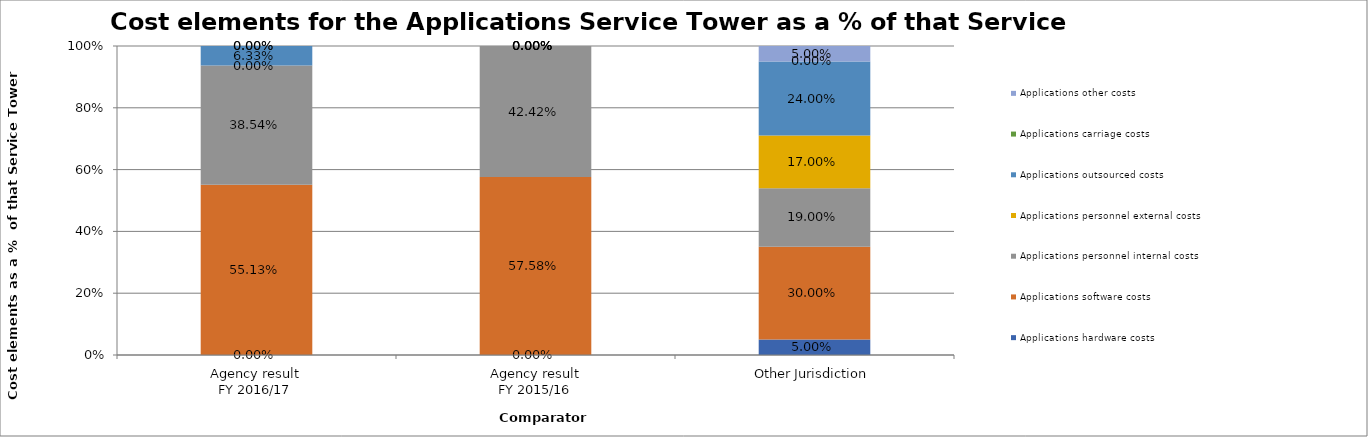
| Category | Applications hardware costs | Applications software costs | Applications personnel internal costs | Applications personnel external costs | Applications outsourced costs | Applications carriage costs | Applications other costs |
|---|---|---|---|---|---|---|---|
| Agency result
FY 2016/17 | 0 | 0.551 | 0.385 | 0 | 0.063 | 0 | 0 |
| Agency result
FY 2015/16 | 0 | 0.576 | 0.424 | 0 | 0 | 0 | 0 |
| Other Jurisdiction | 0.05 | 0.3 | 0.19 | 0.17 | 0.24 | 0 | 0.05 |